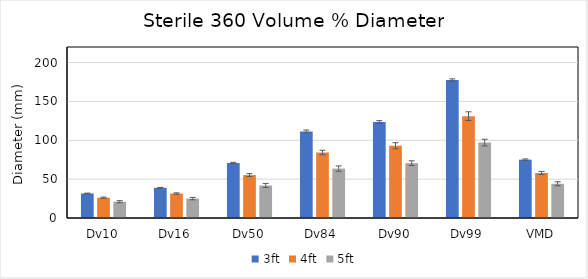
| Category | 3ft | 4ft | 5ft |
|---|---|---|---|
| Dv10 | 31.533 | 26.114 | 20.96 |
| Dv16 | 38.774 | 31.476 | 24.975 |
| Dv50 | 70.699 | 55.208 | 41.859 |
| Dv84 | 111.349 | 84.322 | 63.525 |
| Dv90 | 123.562 | 92.962 | 70.591 |
| Dv99 | 177.499 | 131.034 | 97.015 |
| VMD | 75.084 | 57.901 | 44.044 |